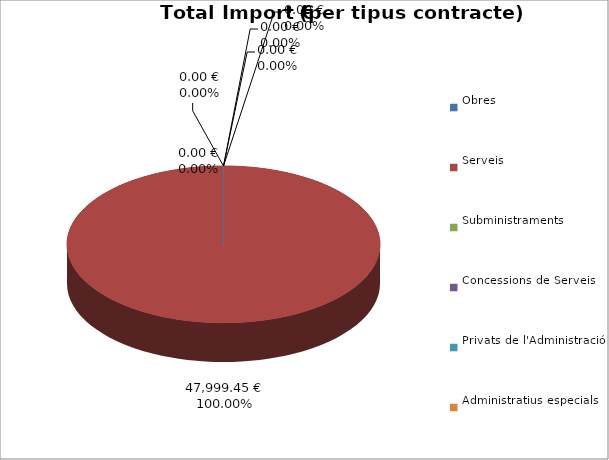
| Category | Total preu
(amb IVA) |
|---|---|
| Obres | 0 |
| Serveis | 47999.45 |
| Subministraments | 0 |
| Concessions de Serveis | 0 |
| Privats de l'Administració | 0 |
| Administratius especials | 0 |